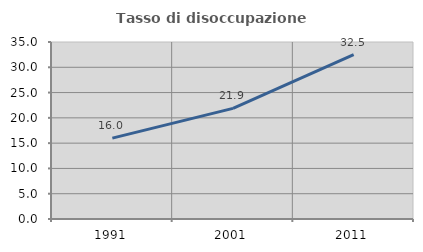
| Category | Tasso di disoccupazione giovanile  |
|---|---|
| 1991.0 | 16 |
| 2001.0 | 21.875 |
| 2011.0 | 32.5 |